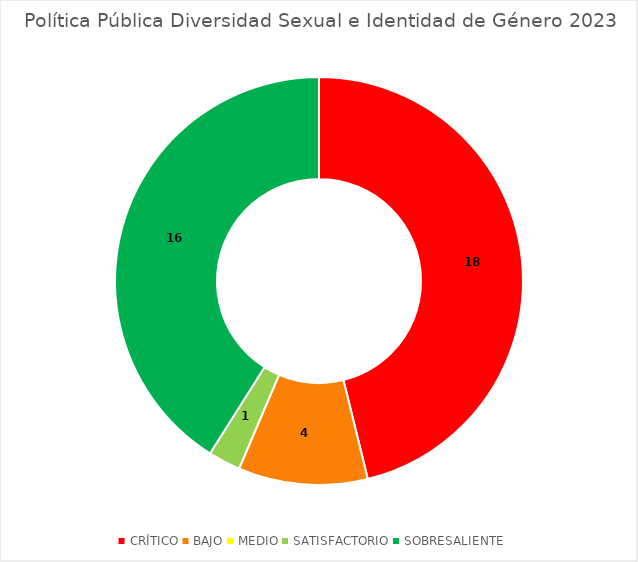
| Category | CANTIDAD |
|---|---|
| CRÍTICO | 18 |
| BAJO | 4 |
| MEDIO | 0 |
| SATISFACTORIO | 1 |
| SOBRESALIENTE | 16 |